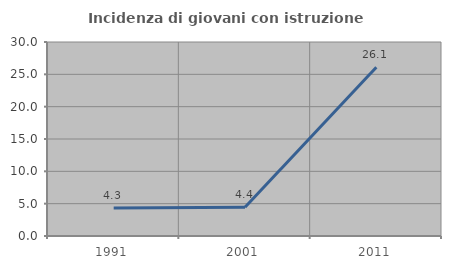
| Category | Incidenza di giovani con istruzione universitaria |
|---|---|
| 1991.0 | 4.348 |
| 2001.0 | 4.444 |
| 2011.0 | 26.087 |